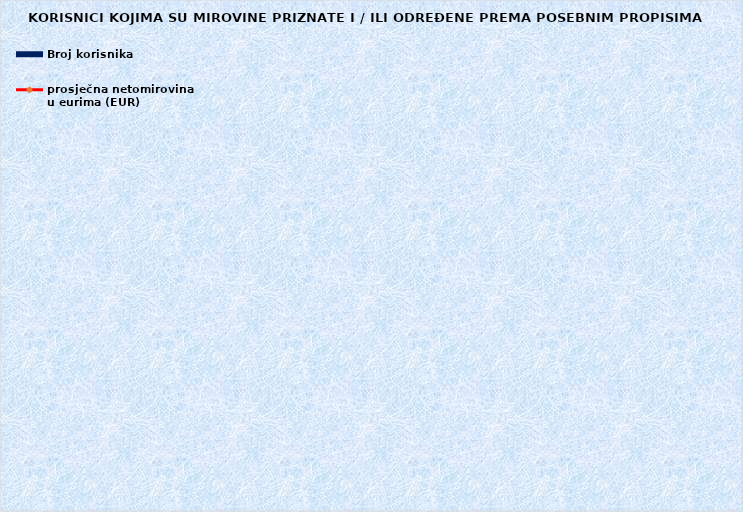
| Category | Broj korisnika |
|---|---|
|      a) radnici na poslovima ovlaštenih službenih osoba u tijelima unutarnjih 
poslova i pravosuđa, kojima je pravo na mirovinu priznato prema propisima
koji su bili na snazi do stupanja na snagu Zakona o pravima iz mirovinskog
osiguranja DVO, PS i OSO | 6954 |
|      b) radnici na  poslovima policijskih službenika, ovlaštenih službenih osoba pravosuđa i službene osobe s posebnim dužnostima i ovlastima u sigurnosno obavještajnom sustavu RH koji su pravo na mirovinu ostvarili prema Zakonu o pravima DVO, PS i OSO | 9582 |
|      c) radnici na poslovima razminiranja | 670 |
| Korisnici koji pravo na mirovinu ostvaruju prema Zakonu o vatrogastvu (NN 125/19)* | 374 |
| Djelatne vojne osobe - DVO  | 16100 |
| Pripadnici Hrvatske domovinske vojske od 1941. do 1945. godine | 1793 |
| Bivši politički zatvorenici | 2029 |
| Hrvatski branitelji iz Domovinskog rata - ZOHBDR | 71281 |
| Mirovine priznate prema općim propisima, a određene prema
ZOHBDR - u iz 2017. (čl. 27., 35., 48. i 49. stavak 2.)  | 58276 |
| Pripadnici bivše Jugoslavenske narodne armije - JNA | 3530 |
| Pripadnici bivše Jugoslavenske narodne armije - JNA - čl. 185 ZOMO | 154 |
| Sudionici Narodnooslobodilačkog rata - NOR | 4704 |
| Zastupnici u Hrvatskom saboru, članovi Vlade, suci Ustavnog suda i glavni državni revizor  | 678 |
| Članovi Izvršnog vijeća Sabora, Saveznog izvršnog vijeća i administrativno umirovljeni javni službenici | 62 |
| Bivši službenici u saveznim tijelima bivše SFRJ - članak 38. ZOMO | 17 |
| Redoviti članovi Hrvatske akademije znanosti i umjetnosti - HAZU | 120 |
| Radnici u Istarskim ugljenokopima "Tupljak" d.d. Labin  | 245 |
| Radnici profesionalno izloženi azbestu | 816 |
| Osiguranici - članovi posade broda u međunarodnoj plovidbi i nacionalnoj plovidbi - članak 129. a stavak 2. Pomorskog zakonika | 205 |
| Pripadnici Hrvatskog vijeća obrane  - HVO  | 6730 |